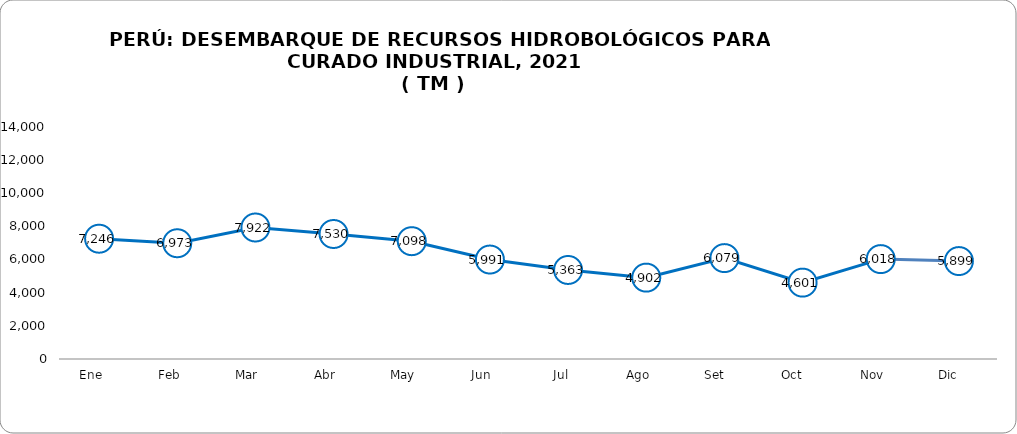
| Category | Total |
|---|---|
| Ene    | 7246.095 |
| Feb    | 6973.132 |
| Mar    | 7921.561 |
| Abr    | 7530.041 |
| May    | 7098.214 |
| Jun    | 5991.351 |
| Jul    | 5363.337 |
| Ago    | 4902.108 |
| Set     | 6078.516 |
| Oct     | 4601.077 |
| Nov    | 6017.906 |
| Dic     | 5899.354 |